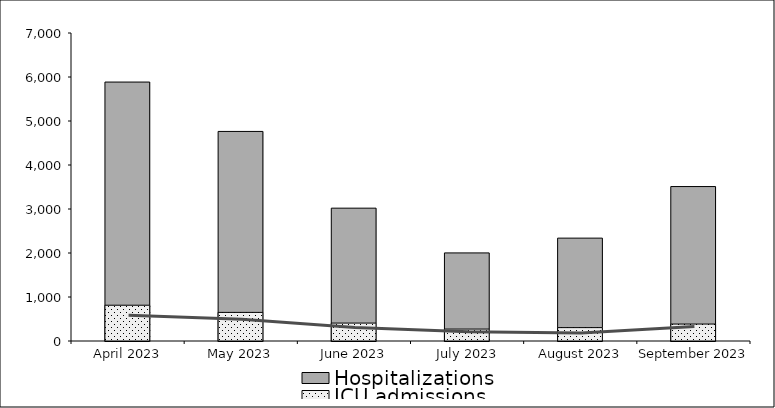
| Category | Hospitalizations | ICU admissions |
|---|---|---|
| April 2023 | 5885 | 813 |
| May 2023 | 4763 | 650 |
| June 2023 | 3019 | 407 |
| July 2023 | 2002 | 271 |
| August 2023 | 2338 | 304 |
| September 2023 | 3510 | 385 |